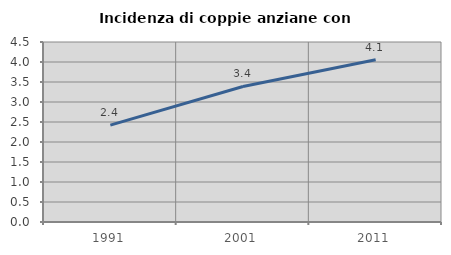
| Category | Incidenza di coppie anziane con figli |
|---|---|
| 1991.0 | 2.421 |
| 2001.0 | 3.388 |
| 2011.0 | 4.055 |